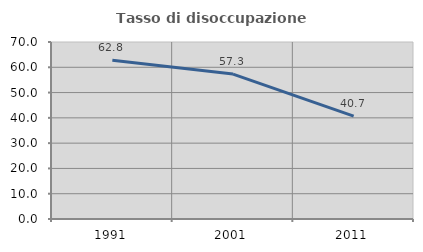
| Category | Tasso di disoccupazione giovanile  |
|---|---|
| 1991.0 | 62.819 |
| 2001.0 | 57.321 |
| 2011.0 | 40.675 |